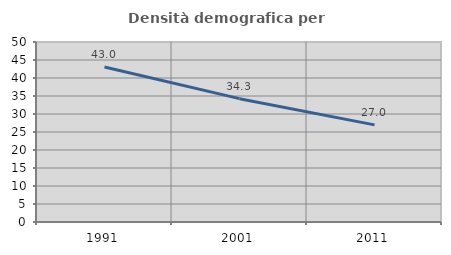
| Category | Densità demografica |
|---|---|
| 1991.0 | 43.037 |
| 2001.0 | 34.263 |
| 2011.0 | 26.976 |